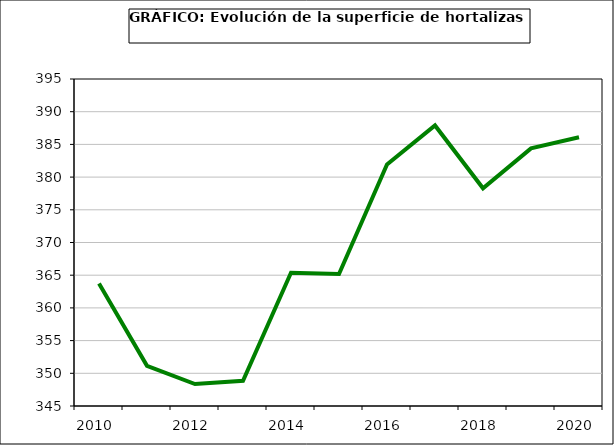
| Category | superficie |
|---|---|
| 2010.0 | 363.729 |
| 2011.0 | 351.145 |
| 2012.0 | 348.359 |
| 2013.0 | 348.853 |
| 2014.0 | 365.385 |
| 2015.0 | 365.178 |
| 2016.0 | 381.94 |
| 2017.0 | 387.895 |
| 2018.0 | 378.294 |
| 2019.0 | 384.392 |
| 2020.0 | 386.084 |